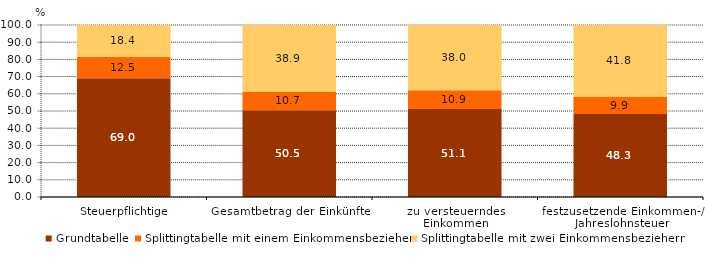
| Category | Grundtabelle | Splittingtabelle mit einem Einkommensbezieher | Splittingtabelle mit zwei Einkommensbeziehern |
|---|---|---|---|
| Steuerpflichtige | 69 | 12.5 | 18.4 |
| Gesamtbetrag der Einkünfte | 50.5 | 10.7 | 38.9 |
| zu versteuerndes 
Einkommen | 51.1 | 10.9 | 38 |
| festzusetzende Einkommen-/ Jahreslohnsteuer | 48.3 | 9.9 | 41.8 |